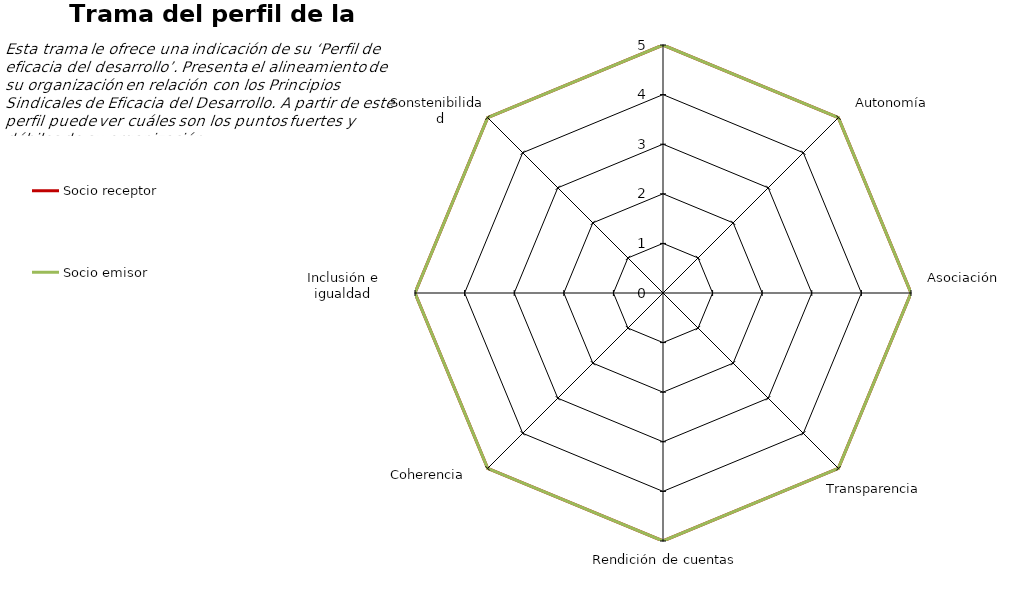
| Category | Socio receptor  | Socio emisor |
|---|---|---|
| 0 | 5 | 5 |
| 1 | 5 | 5 |
| 2 | 5 | 5 |
| 3 | 5 | 5 |
| 4 | 5 | 5 |
| 5 | 5 | 5 |
| 6 | 5 | 5 |
| 7 | 5 | 5 |